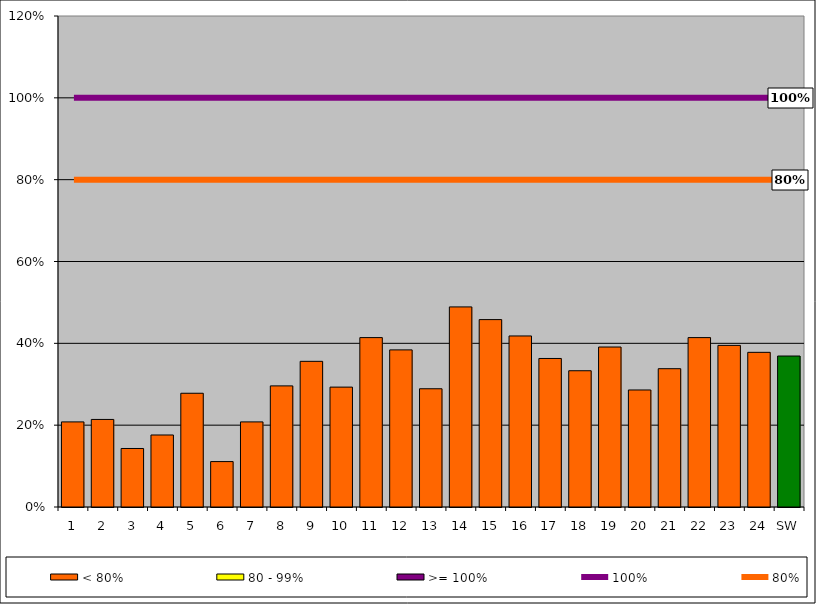
| Category | < 80% | 80 - 99% | >= 100% |
|---|---|---|---|
| 1 | 0.208 | 0 | 0 |
| 2 | 0.214 | 0 | 0 |
| 3 | 0.143 | 0 | 0 |
| 4 | 0.176 | 0 | 0 |
| 5 | 0.278 | 0 | 0 |
| 6 | 0.111 | 0 | 0 |
| 7 | 0.208 | 0 | 0 |
| 8 | 0.296 | 0 | 0 |
| 9 | 0.356 | 0 | 0 |
| 10 | 0.293 | 0 | 0 |
| 11 | 0.414 | 0 | 0 |
| 12 | 0.384 | 0 | 0 |
| 13 | 0.289 | 0 | 0 |
| 14 | 0.489 | 0 | 0 |
| 15 | 0.458 | 0 | 0 |
| 16 | 0.418 | 0 | 0 |
| 17 | 0.363 | 0 | 0 |
| 18 | 0.333 | 0 | 0 |
| 19 | 0.391 | 0 | 0 |
| 20 | 0.286 | 0 | 0 |
| 21 | 0.338 | 0 | 0 |
| 22 | 0.414 | 0 | 0 |
| 23 | 0.395 | 0 | 0 |
| 24 | 0.378 | 0 | 0 |
| SW | 0.369 | 0 | 0 |